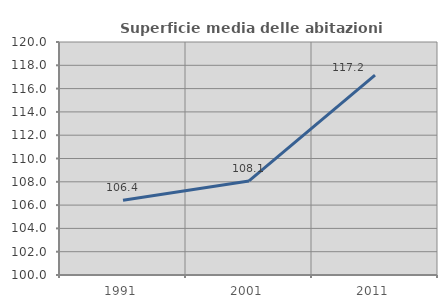
| Category | Superficie media delle abitazioni occupate |
|---|---|
| 1991.0 | 106.425 |
| 2001.0 | 108.074 |
| 2011.0 | 117.161 |